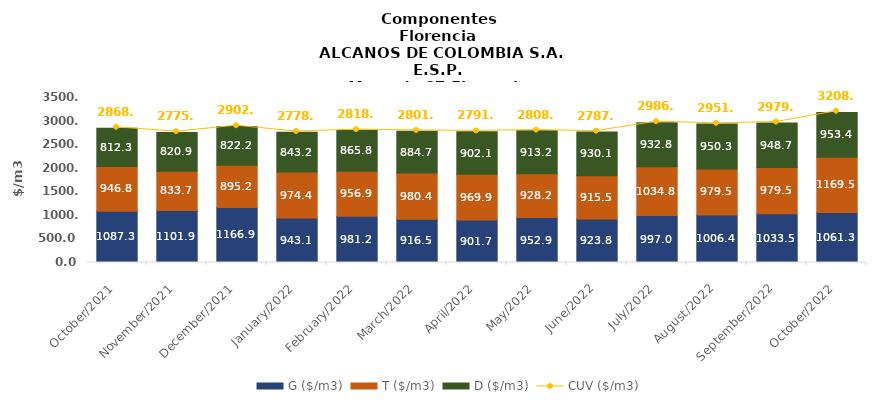
| Category | G ($/m3) | T ($/m3) | D ($/m3) |
|---|---|---|---|
| 2021-10-01 | 1087.34 | 946.76 | 812.32 |
| 2021-11-01 | 1101.92 | 833.69 | 820.85 |
| 2021-12-01 | 1166.9 | 895.22 | 822.17 |
| 2022-01-01 | 943.11 | 974.42 | 843.23 |
| 2022-02-01 | 981.24 | 956.88 | 865.81 |
| 2022-03-01 | 916.5 | 980.4 | 884.73 |
| 2022-04-01 | 901.73 | 969.87 | 902.09 |
| 2022-05-01 | 952.91 | 928.23 | 913.22 |
| 2022-06-01 | 923.8 | 915.47 | 930.11 |
| 2022-07-01 | 996.95 | 1034.77 | 932.75 |
| 2022-08-01 | 1006.44 | 979.53 | 950.32 |
| 2022-09-01 | 1033.47 | 979.51 | 948.67 |
| 2022-10-01 | 1061.27 | 1169.53 | 953.42 |